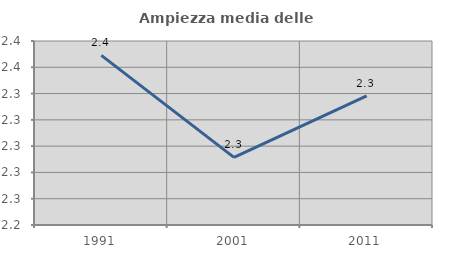
| Category | Ampiezza media delle famiglie |
|---|---|
| 1991.0 | 2.369 |
| 2001.0 | 2.291 |
| 2011.0 | 2.338 |